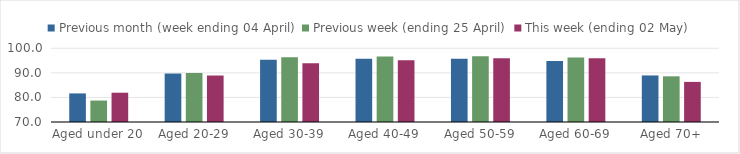
| Category | Previous month (week ending 04 April) | Previous week (ending 25 April) | This week (ending 02 May) |
|---|---|---|---|
| Aged under 20 | 81.631 | 78.729 | 81.918 |
| Aged 20-29 | 89.727 | 89.948 | 88.914 |
| Aged 30-39 | 95.306 | 96.33 | 93.87 |
| Aged 40-49 | 95.743 | 96.666 | 95.112 |
| Aged 50-59 | 95.726 | 96.778 | 95.954 |
| Aged 60-69 | 94.831 | 96.3 | 95.972 |
| Aged 70+ | 88.95 | 88.591 | 86.319 |